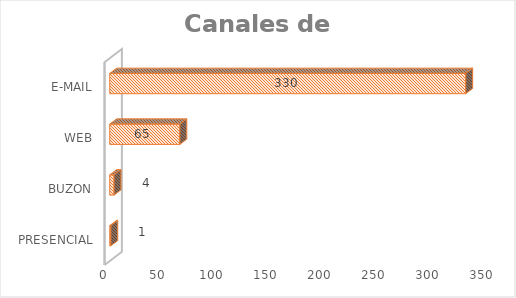
| Category | Series 0 |
|---|---|
| PRESENCIAL | 1 |
| BUZON | 4 |
| WEB | 65 |
| E-MAIL | 330 |